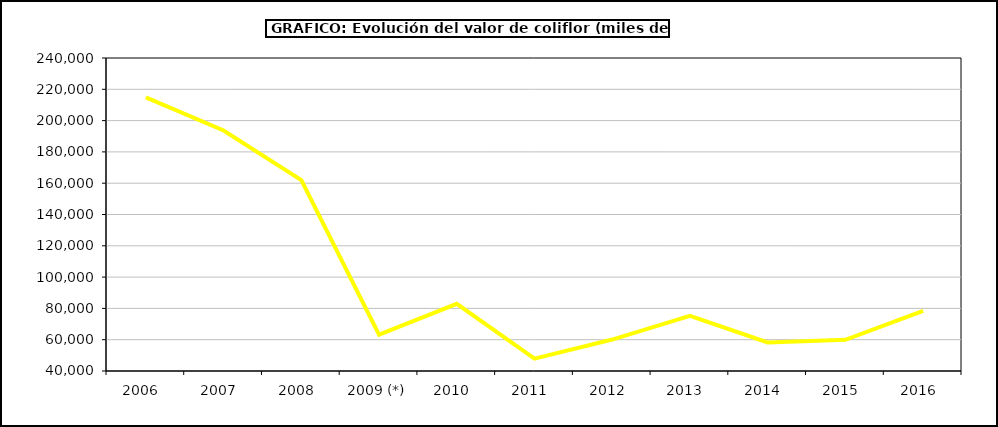
| Category | Valor |
|---|---|
| 2006  | 214820 |
| 2007  | 193667.735 |
| 2008  | 161966.625 |
| 2009 (*) | 63214.224 |
| 2010  | 82925.588 |
| 2011  | 47916.69 |
| 2012  | 60097.372 |
| 2013  | 75196.05 |
| 2014  | 58249.149 |
| 2015  | 59963 |
| 2016  | 78452 |